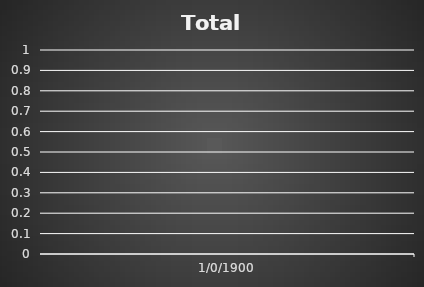
| Category | Total Score |
|---|---|
| 0.0 | 0 |
| 0.0 | 0 |
| 0.0 | 0 |